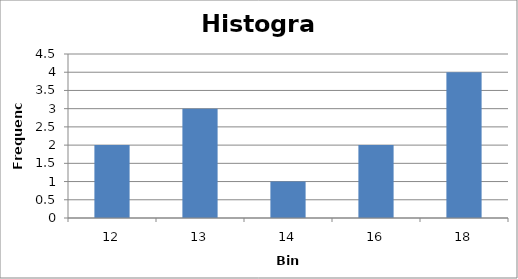
| Category | Series 0 |
|---|---|
| 12.0 | 2 |
| 13.0 | 3 |
| 14.0 | 1 |
| 16.0 | 2 |
| 18.0 | 4 |